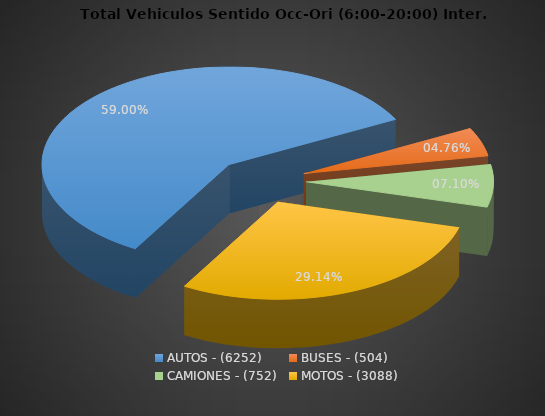
| Category | PORCENTAJE |
|---|---|
| AUTOS - (6252) | 59.003 |
| BUSES - (504) | 4.757 |
| CAMIONES - (752) | 7.097 |
| MOTOS - (3088) | 29.143 |